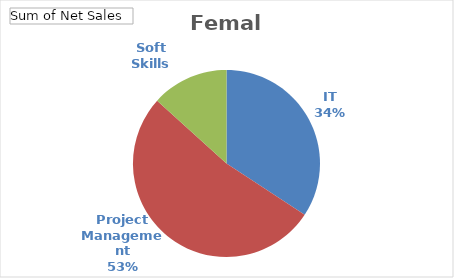
| Category | Female | Male |
|---|---|---|
| IT | 101343 | 79203 |
| Project Management | 155235 | 116235 |
| Soft Skills | 39353 | 22750 |